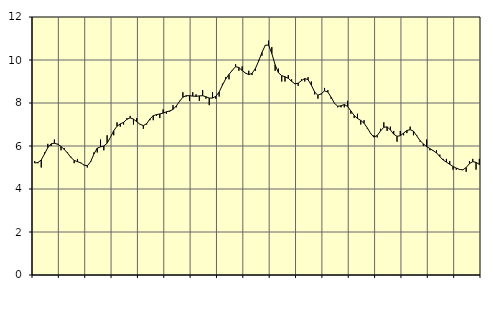
| Category | Piggar | Series 1 |
|---|---|---|
| nan | 5.3 | 5.21 |
| 87.0 | 5.2 | 5.23 |
| 87.0 | 5 | 5.35 |
| 87.0 | 5.7 | 5.63 |
| nan | 6.1 | 5.93 |
| 88.0 | 6 | 6.1 |
| 88.0 | 6.3 | 6.13 |
| 88.0 | 6.1 | 6.08 |
| nan | 5.8 | 5.98 |
| 89.0 | 5.9 | 5.84 |
| 89.0 | 5.7 | 5.67 |
| 89.0 | 5.5 | 5.47 |
| nan | 5.2 | 5.33 |
| 90.0 | 5.4 | 5.27 |
| 90.0 | 5.2 | 5.22 |
| 90.0 | 5.1 | 5.11 |
| nan | 5 | 5.08 |
| 91.0 | 5.3 | 5.27 |
| 91.0 | 5.7 | 5.63 |
| 91.0 | 5.7 | 5.9 |
| nan | 6.3 | 5.96 |
| 92.0 | 5.8 | 6 |
| 92.0 | 6.5 | 6.13 |
| 92.0 | 6.4 | 6.4 |
| nan | 6.5 | 6.71 |
| 93.0 | 7.1 | 6.92 |
| 93.0 | 6.9 | 7.03 |
| 93.0 | 7 | 7.1 |
| nan | 7.3 | 7.24 |
| 94.0 | 7.4 | 7.31 |
| 94.0 | 7 | 7.25 |
| 94.0 | 7.3 | 7.13 |
| nan | 7 | 7.01 |
| 95.0 | 6.8 | 6.95 |
| 95.0 | 7 | 7.04 |
| 95.0 | 7.2 | 7.26 |
| nan | 7.2 | 7.41 |
| 96.0 | 7.4 | 7.46 |
| 96.0 | 7.3 | 7.49 |
| 96.0 | 7.7 | 7.53 |
| nan | 7.5 | 7.59 |
| 97.0 | 7.6 | 7.63 |
| 97.0 | 7.9 | 7.7 |
| 97.0 | 7.8 | 7.86 |
| nan | 8.1 | 8.08 |
| 98.0 | 8.5 | 8.27 |
| 98.0 | 8.3 | 8.34 |
| 98.0 | 8.1 | 8.34 |
| nan | 8.5 | 8.32 |
| 99.0 | 8.4 | 8.31 |
| 99.0 | 8.1 | 8.33 |
| 99.0 | 8.6 | 8.34 |
| nan | 8.2 | 8.29 |
| 0.0 | 7.9 | 8.23 |
| 0.0 | 8.5 | 8.23 |
| 0.0 | 8.2 | 8.31 |
| nan | 8.3 | 8.51 |
| 1.0 | 8.9 | 8.83 |
| 1.0 | 9.2 | 9.12 |
| 1.0 | 9.1 | 9.33 |
| nan | 9.5 | 9.52 |
| 2.0 | 9.8 | 9.69 |
| 2.0 | 9.5 | 9.65 |
| 2.0 | 9.7 | 9.51 |
| nan | 9.4 | 9.39 |
| 3.0 | 9.5 | 9.32 |
| 3.0 | 9.3 | 9.38 |
| 3.0 | 9.5 | 9.6 |
| nan | 10 | 9.95 |
| 4.0 | 10.2 | 10.35 |
| 4.0 | 10.7 | 10.68 |
| 4.0 | 10.9 | 10.7 |
| nan | 10.6 | 10.3 |
| 5.0 | 9.5 | 9.78 |
| 5.0 | 9.6 | 9.41 |
| 5.0 | 9 | 9.27 |
| nan | 9 | 9.22 |
| 6.0 | 9.3 | 9.15 |
| 6.0 | 9.1 | 9.01 |
| 6.0 | 8.9 | 8.89 |
| nan | 8.8 | 8.92 |
| 7.0 | 9.1 | 9.04 |
| 7.0 | 9 | 9.14 |
| 7.0 | 9.2 | 9.08 |
| nan | 9 | 8.83 |
| 8.0 | 8.4 | 8.51 |
| 8.0 | 8.2 | 8.36 |
| 8.0 | 8.4 | 8.43 |
| nan | 8.7 | 8.56 |
| 9.0 | 8.6 | 8.51 |
| 9.0 | 8.2 | 8.27 |
| 9.0 | 8 | 7.99 |
| nan | 7.8 | 7.85 |
| 10.0 | 7.8 | 7.87 |
| 10.0 | 7.8 | 7.93 |
| 10.0 | 8.1 | 7.84 |
| nan | 7.5 | 7.63 |
| 11.0 | 7.3 | 7.42 |
| 11.0 | 7.5 | 7.28 |
| 11.0 | 7 | 7.19 |
| nan | 7.2 | 7.06 |
| 12.0 | 6.8 | 6.84 |
| 12.0 | 6.6 | 6.58 |
| 12.0 | 6.5 | 6.41 |
| nan | 6.4 | 6.49 |
| 13.0 | 6.8 | 6.7 |
| 13.0 | 7.1 | 6.87 |
| 13.0 | 6.7 | 6.89 |
| nan | 6.9 | 6.75 |
| 14.0 | 6.7 | 6.55 |
| 14.0 | 6.2 | 6.45 |
| 14.0 | 6.7 | 6.48 |
| nan | 6.5 | 6.6 |
| 15.0 | 6.6 | 6.72 |
| 15.0 | 6.9 | 6.76 |
| 15.0 | 6.5 | 6.69 |
| nan | 6.5 | 6.47 |
| 16.0 | 6.2 | 6.25 |
| 16.0 | 6 | 6.1 |
| 16.0 | 6.3 | 5.97 |
| nan | 5.8 | 5.88 |
| 17.0 | 5.8 | 5.78 |
| 17.0 | 5.8 | 5.68 |
| 17.0 | 5.6 | 5.51 |
| nan | 5.4 | 5.35 |
| 18.0 | 5.4 | 5.25 |
| 18.0 | 5.3 | 5.15 |
| 18.0 | 4.9 | 5.05 |
| nan | 4.9 | 4.97 |
| 19.0 | 4.9 | 4.91 |
| 19.0 | 4.9 | 4.89 |
| 19.0 | 4.8 | 5 |
| nan | 5.3 | 5.18 |
| 20.0 | 5.4 | 5.27 |
| 20.0 | 4.9 | 5.24 |
| 20.0 | 5.4 | 5.14 |